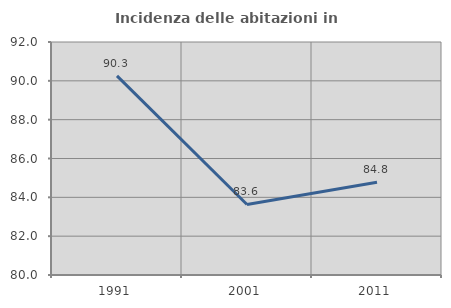
| Category | Incidenza delle abitazioni in proprietà  |
|---|---|
| 1991.0 | 90.256 |
| 2001.0 | 83.632 |
| 2011.0 | 84.774 |